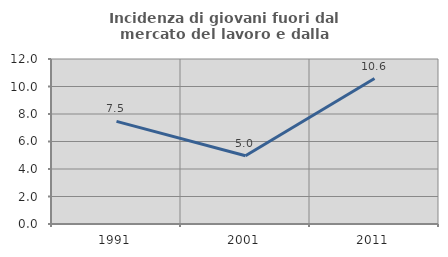
| Category | Incidenza di giovani fuori dal mercato del lavoro e dalla formazione  |
|---|---|
| 1991.0 | 7.461 |
| 2001.0 | 4.964 |
| 2011.0 | 10.576 |